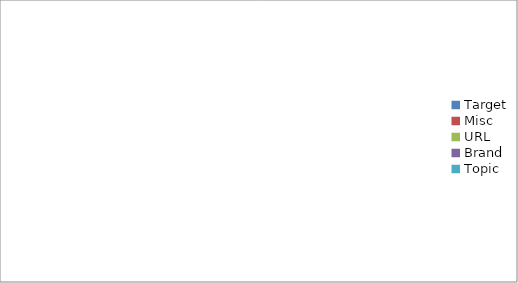
| Category | Series 0 | Series 1 |
|---|---|---|
| Target | 0 |  |
| Misc | 0 |  |
| URL | 0 |  |
| Brand | 0 |  |
| Topic | 0 |  |